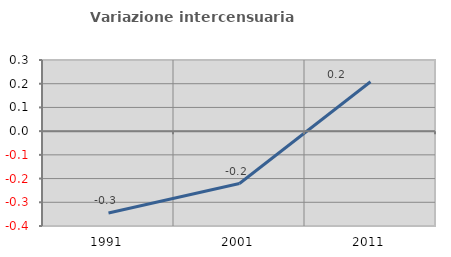
| Category | Variazione intercensuaria annua |
|---|---|
| 1991.0 | -0.345 |
| 2001.0 | -0.221 |
| 2011.0 | 0.208 |